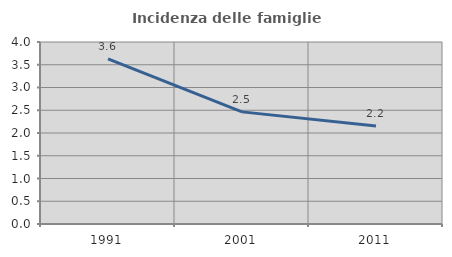
| Category | Incidenza delle famiglie numerose |
|---|---|
| 1991.0 | 3.631 |
| 2001.0 | 2.464 |
| 2011.0 | 2.152 |